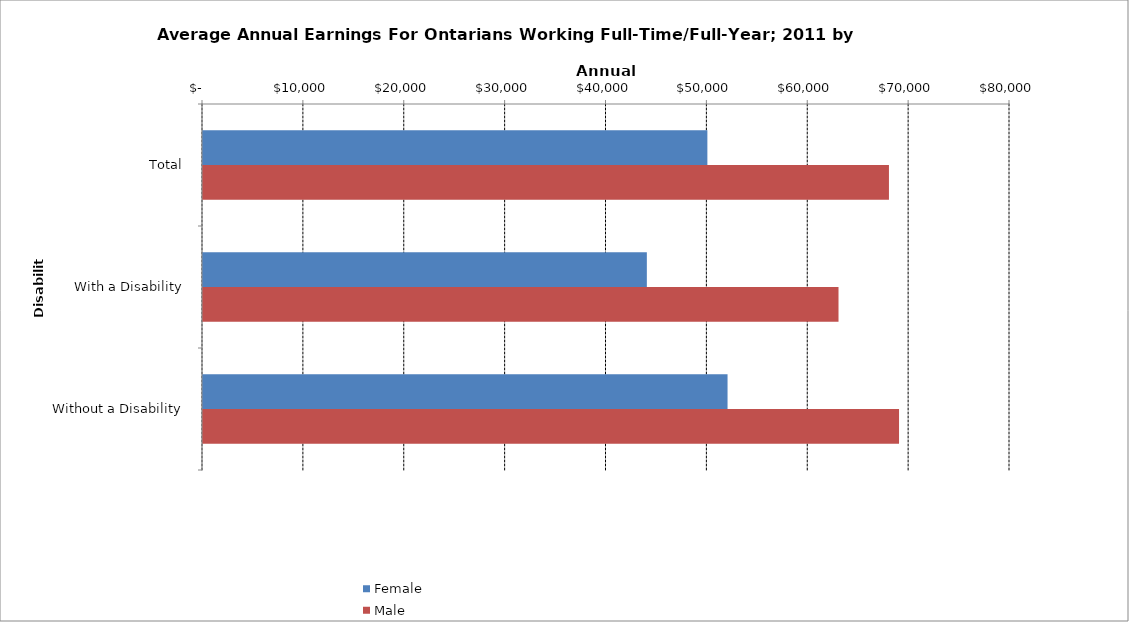
| Category | Female | Male |
|---|---|---|
| Total | 50000 | 68000 |
|  With a Disability  | 44000 | 63000 |
|  Without a Disability  | 52000 | 69000 |